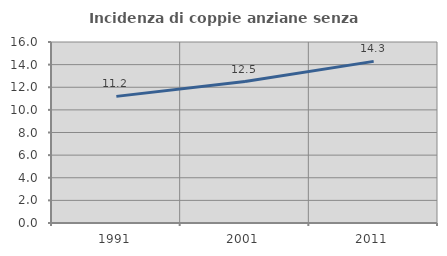
| Category | Incidenza di coppie anziane senza figli  |
|---|---|
| 1991.0 | 11.194 |
| 2001.0 | 12.5 |
| 2011.0 | 14.286 |